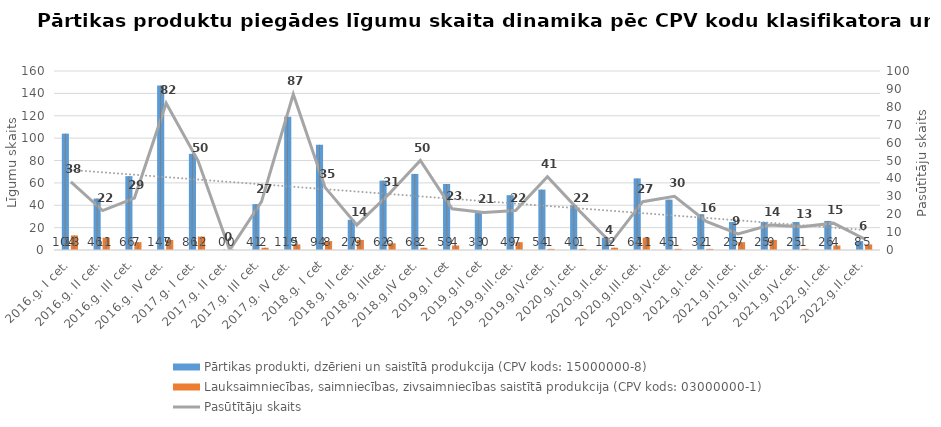
| Category | Pārtikas produkti, dzērieni un saistītā produkcija (CPV kods: 15000000-8) | Lauksaimniecības, saimniecības, zivsaimniecības saistītā produkcija (CPV kods: 03000000-1) |
|---|---|---|
| 2016.g. I cet. | 104 | 13 |
| 2016.g. II cet. | 46 | 11 |
| 2016.g. III cet. | 66 | 7 |
| 2016.g. IV cet. | 147 | 9 |
| 2017.g. I cet. | 86 | 12 |
| 2017.g. II cet. | 0 | 0 |
| 2017.g. III cet. | 41 | 2 |
| 2017.g. IV cet. | 119 | 5 |
| 2018.g. I cet | 94 | 8 |
| 2018.g. II cet. | 27 | 9 |
| 2018.g. IIIcet. | 62 | 6 |
| 2018.g.IV cet. | 68 | 2 |
| 2019.g.I cet | 59 | 4 |
| 2019.g.II cet | 33 | 0 |
| 2019.g.III.cet. | 49 | 7 |
| 2019.g.IV.cet. | 54 | 1 |
| 2020.g.I.cet. | 40 | 1 |
| 2020.g.II.cet. | 11 | 2 |
| 2020.g.III.cet. | 64 | 11 |
| 2020.g.IV.cet. | 45 | 1 |
| 2021.g.I.cet. | 32 | 1 |
| 2021.g.II.cet. | 25 | 7 |
| 2021.g.III.cet. | 25 | 9 |
| 2021.g.IV.cet. | 25 | 1 |
| 2022.g.I.cet. | 26 | 4 |
| 2022.g.II.cet. | 8 | 5 |